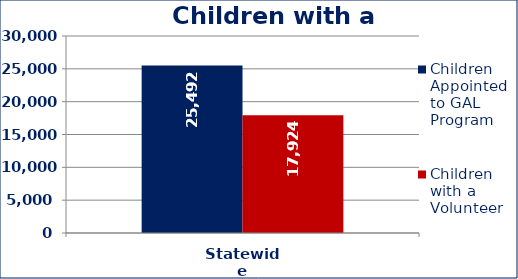
| Category | Children Appointed to GAL Program  | Children with a Volunteer  |
|---|---|---|
| Statewide | 25492 | 17924 |